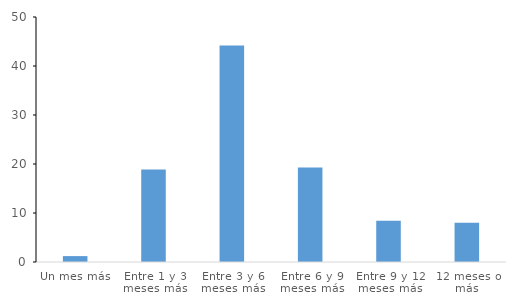
| Category | Series 0 |
|---|---|
| Un mes más | 1.205 |
| Entre 1 y 3 meses más | 18.876 |
| Entre 3 y 6 meses más | 44.177 |
| Entre 6 y 9 meses más | 19.277 |
| Entre 9 y 12 meses más | 8.434 |
| 12 meses o más | 8.032 |